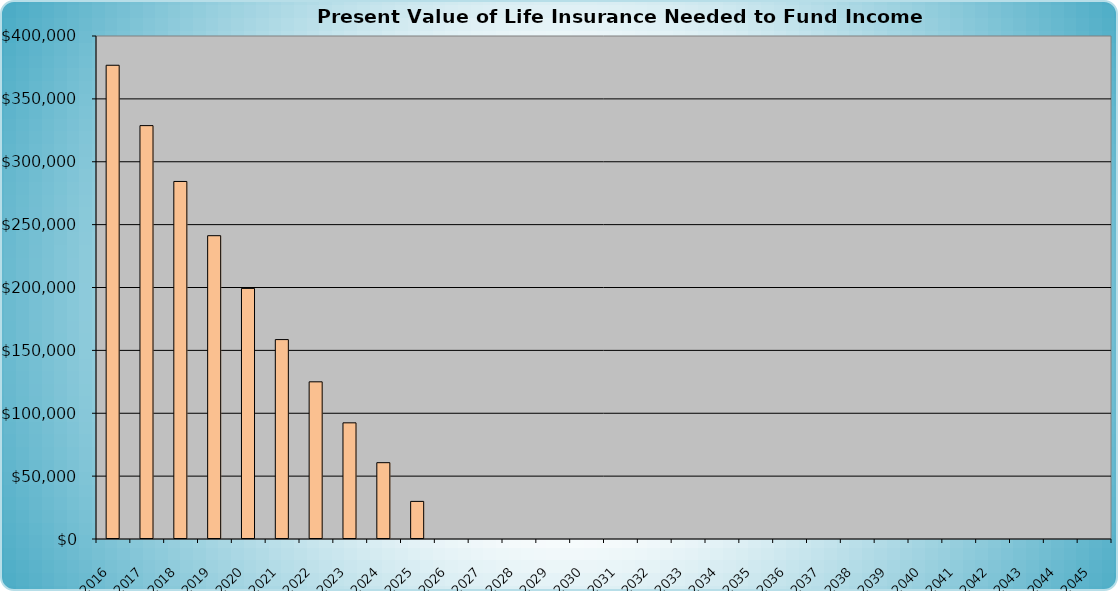
| Category | Present Value of Life Insurance Needed to Fund Income Replacement |
|---|---|
| 2016.0 | 376738.288 |
| 2017.0 | 328738.288 |
| 2018.0 | 284330.125 |
| 2019.0 | 241190.766 |
| 2020.0 | 199283.961 |
| 2021.0 | 158574.493 |
| 2022.0 | 124994.8 |
| 2023.0 | 92374.527 |
| 2024.0 | 60686.261 |
| 2025.0 | 29903.375 |
| 2026.0 | 0 |
| 2027.0 | 0 |
| 2028.0 | 0 |
| 2029.0 | 0 |
| 2030.0 | 0 |
| 2031.0 | 0 |
| 2032.0 | 0 |
| 2033.0 | 0 |
| 2034.0 | 0 |
| 2035.0 | 0 |
| 2036.0 | 0 |
| 2037.0 | 0 |
| 2038.0 | 0 |
| 2039.0 | 0 |
| 2040.0 | 0 |
| 2041.0 | 0 |
| 2042.0 | 0 |
| 2043.0 | 0 |
| 2044.0 | 0 |
| 2045.0 | 0 |